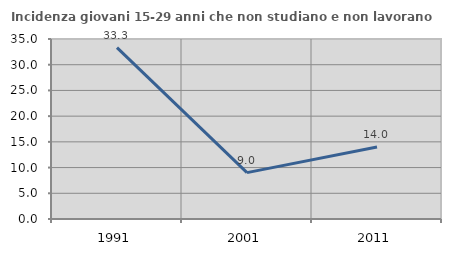
| Category | Incidenza giovani 15-29 anni che non studiano e non lavorano  |
|---|---|
| 1991.0 | 33.333 |
| 2001.0 | 9.013 |
| 2011.0 | 14.002 |